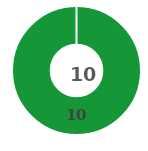
| Category | Series 0 |
|---|---|
| 0 | 10 |
| 1 | 0 |
| 2 | 0 |
| 3 | 0 |
| 4 | 0 |